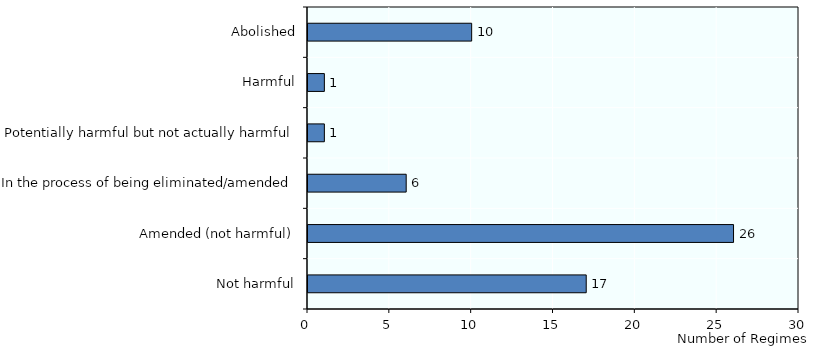
| Category | Count |
|---|---|
| Not harmful | 17 |
| Amended (not harmful) | 26 |
| In the process of being eliminated/amended | 6 |
| Potentially harmful but not actually harmful | 1 |
| Harmful | 1 |
| Abolished | 10 |